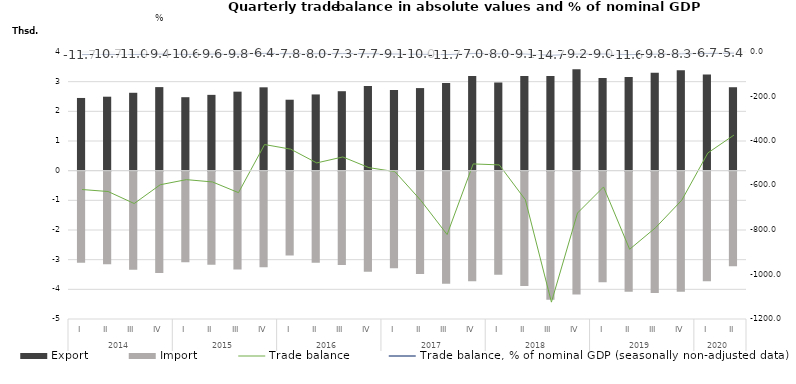
| Category | Export | Import |
|---|---|---|
| 0 | 2450.7 | -3068.8 |
| 1 | 2493.4 | -3120.5 |
| 2 | 2625.5 | -3306.5 |
| 3 | 2816.7 | -3413.2 |
| 4 | 2476.5 | -3050.1 |
| 5 | 2555.2 | -3139.2 |
| 6 | 2663.4 | -3295.5 |
| 7 | 2809.5 | -3225.4 |
| 8 | 2391.5 | -2828.1 |
| 9 | 2569.5 | -3068 |
| 10 | 2678.2 | -3149.9 |
| 11 | 2850.8 | -3370.5 |
| 12 | 2719.6 | -3257.4 |
| 13 | 2783.8 | -3452 |
| 14 | 2956.9 | -3777.4 |
| 15 | 3187 | -3690 |
| 16 | 2969.9 | -3477.4 |
| 17 | 3193.3 | -3857.4 |
| 18 | 3189.7 | -4313.9 |
| 19 | 3420.5 | -4144.2 |
| 20 | 3123.6 | -3730.2 |
| 21 | 3158.2 | -4044.8 |
| 22 | 3298.5 | -4087.5 |
| 23 | 3385.3 | -4051.1 |
| 24 | 3239 | -3692.6 |
| 25 | 2812.4 | -3185.8 |